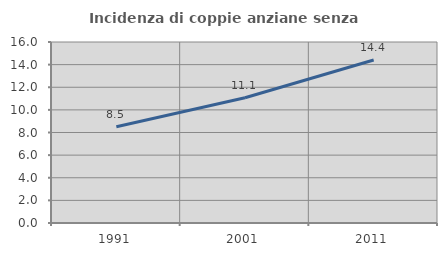
| Category | Incidenza di coppie anziane senza figli  |
|---|---|
| 1991.0 | 8.509 |
| 2001.0 | 11.075 |
| 2011.0 | 14.412 |